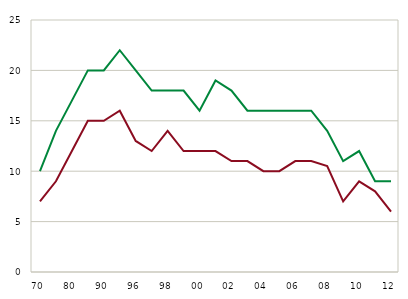
| Category | Mænd | Kvinder |
|---|---|---|
| 70 | 10 | 7 |
| 75 | 14 | 9 |
| 80 | 17 | 12 |
| 85 | 20 | 15 |
| 90 | 20 | 15 |
| 95 | 22 | 16 |
| 96 | 20 | 13 |
| 97 | 18 | 12 |
| 98 | 18 | 14 |
| 99 | 18 | 12 |
| 00 | 16 | 12 |
| 01 | 19 | 12 |
| 02 | 18 | 11 |
| 03 | 16 | 11 |
| 04 | 16 | 10 |
| 05 | 16 | 10 |
| 06 | 16 | 11 |
| 07 | 16 | 11 |
| 08 | 14 | 10.5 |
| 09 | 11 | 7 |
| 10 | 12 | 9 |
| 11 | 9 | 8 |
| 12 | 9 | 6 |